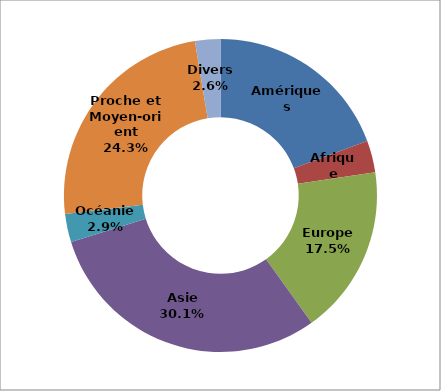
| Category | Series 0 |
|---|---|
| Amériques | 737 |
| Afrique | 124.7 |
| Europe | 666.4 |
| Asie | 1145.6 |
| Océanie | 111.4 |
| Proche et Moyen-orient | 924 |
| Divers | 99.8 |